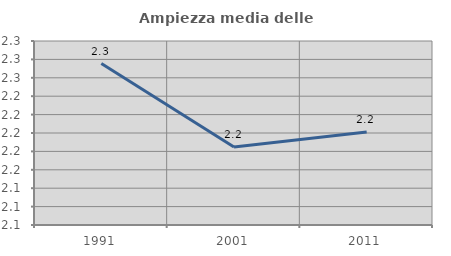
| Category | Ampiezza media delle famiglie |
|---|---|
| 1991.0 | 2.275 |
| 2001.0 | 2.185 |
| 2011.0 | 2.201 |